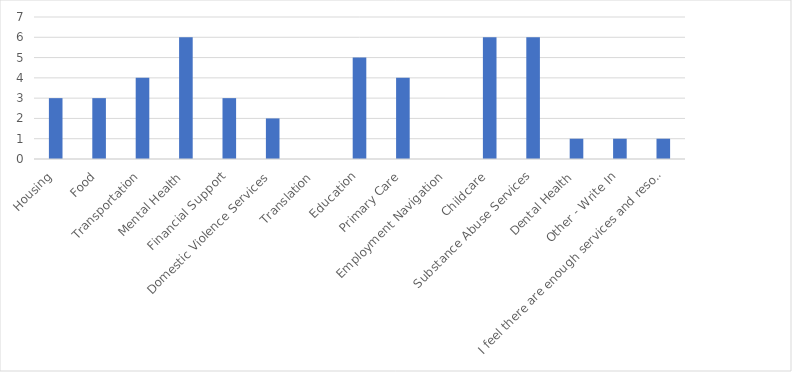
| Category | Number of Responses |
|---|---|
| Housing | 3 |
| Food | 3 |
| Transportation | 4 |
| Mental Health | 6 |
| Financial Support | 3 |
| Domestic Violence Services | 2 |
| Translation | 0 |
| Education | 5 |
| Primary Care | 4 |
| Employment Navigation | 0 |
| Childcare | 6 |
| Substance Abuse Services | 6 |
| Dental Health | 1 |
| Other - Write In | 1 |
| I feel there are enough services and resources to refer my patients/clients to. | 1 |